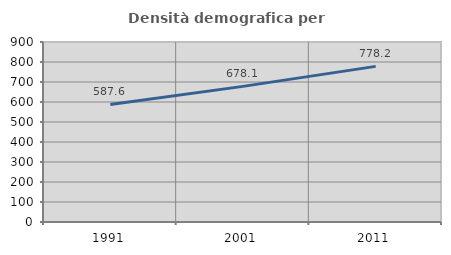
| Category | Densità demografica |
|---|---|
| 1991.0 | 587.622 |
| 2001.0 | 678.107 |
| 2011.0 | 778.173 |